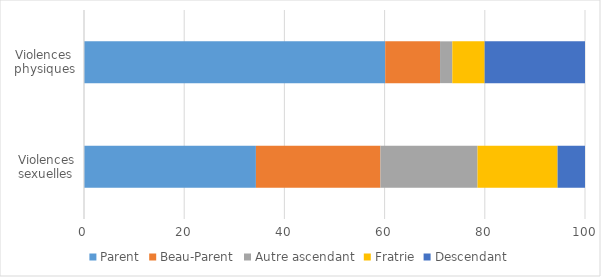
| Category | Parent | Beau-Parent | Autre ascendant | Fratrie | Descendant |
|---|---|---|---|---|---|
| Violences sexuelles | 34.314 | 24.855 | 19.38 | 15.975 | 5.475 |
| Violences physiques | 60.12 | 10.948 | 2.447 | 6.452 | 20.033 |